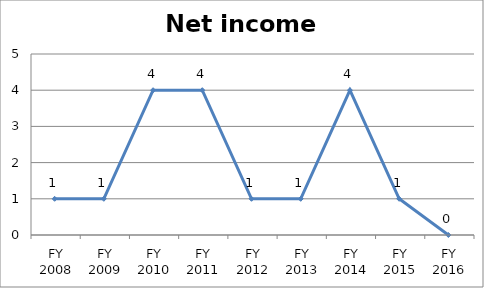
| Category | Net income score |
|---|---|
| FY 2016 | 0 |
| FY 2015 | 1 |
| FY 2014 | 4 |
| FY 2013 | 1 |
| FY 2012 | 1 |
| FY 2011 | 4 |
| FY 2010 | 4 |
| FY 2009 | 1 |
| FY 2008 | 1 |